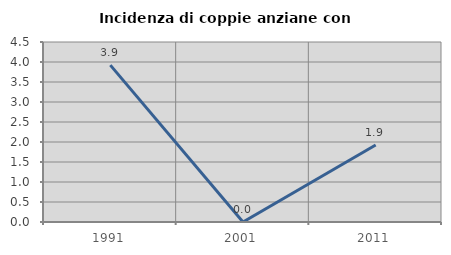
| Category | Incidenza di coppie anziane con figli |
|---|---|
| 1991.0 | 3.922 |
| 2001.0 | 0 |
| 2011.0 | 1.923 |